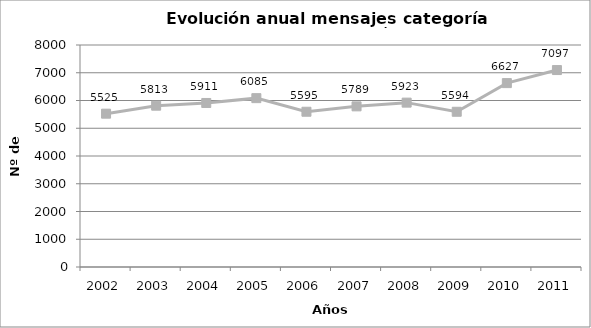
| Category | TOTAL mensajes por año |
|---|---|
| 2002.0 | 5525 |
| 2003.0 | 5813 |
| 2004.0 | 5911 |
| 2005.0 | 6085 |
| 2006.0 | 5595 |
| 2007.0 | 5789 |
| 2008.0 | 5923 |
| 2009.0 | 5594 |
| 2010.0 | 6627 |
| 2011.0 | 7097 |